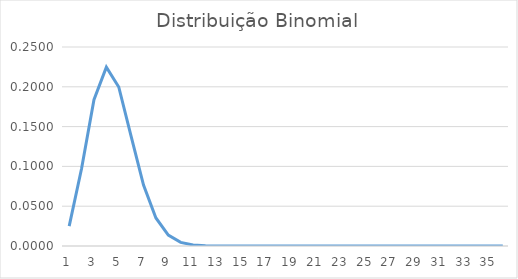
| Category | Series 0 |
|---|---|
| 0 | 0.025 |
| 1 | 0.097 |
| 2 | 0.184 |
| 3 | 0.225 |
| 4 | 0.2 |
| 5 | 0.138 |
| 6 | 0.076 |
| 7 | 0.035 |
| 8 | 0.014 |
| 9 | 0.005 |
| 10 | 0.001 |
| 11 | 0 |
| 12 | 0 |
| 13 | 0 |
| 14 | 0 |
| 15 | 0 |
| 16 | 0 |
| 17 | 0 |
| 18 | 0 |
| 19 | 0 |
| 20 | 0 |
| 21 | 0 |
| 22 | 0 |
| 23 | 0 |
| 24 | 0 |
| 25 | 0 |
| 26 | 0 |
| 27 | 0 |
| 28 | 0 |
| 29 | 0 |
| 30 | 0 |
| 31 | 0 |
| 32 | 0 |
| 33 | 0 |
| 34 | 0 |
| 35 | 0 |